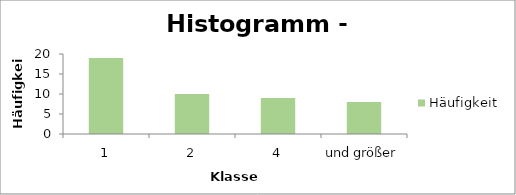
| Category | Häufigkeit |
|---|---|
| 1 | 19 |
| 2 | 10 |
| 4 | 9 |
| und größer | 8 |